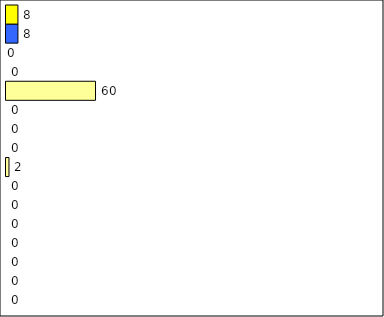
| Category | -2 | -1 | 0 | 1 | 2 | 3 | 4 | 5 | 6 | 7 | 8 | 9 | 10 | 11 | 12 | Perfect Round |
|---|---|---|---|---|---|---|---|---|---|---|---|---|---|---|---|---|
| 0 | 0 | 0 | 0 | 0 | 0 | 0 | 0 | 2 | 0 | 0 | 0 | 60 | 0 | 0 | 8 | 8 |